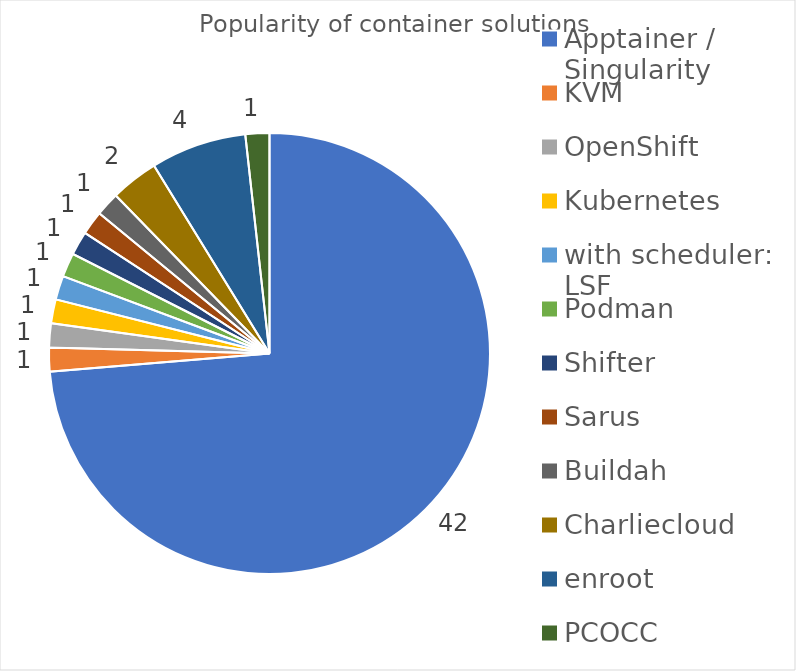
| Category | Series 0 |
|---|---|
| Apptainer / Singularity | 42 |
| KVM | 1 |
| OpenShift | 1 |
| Kubernetes | 1 |
| with scheduler: LSF | 1 |
| Podman | 1 |
| Shifter | 1 |
| Sarus | 1 |
| Buildah | 1 |
| Charliecloud | 2 |
| enroot | 4 |
| PCOCC | 1 |